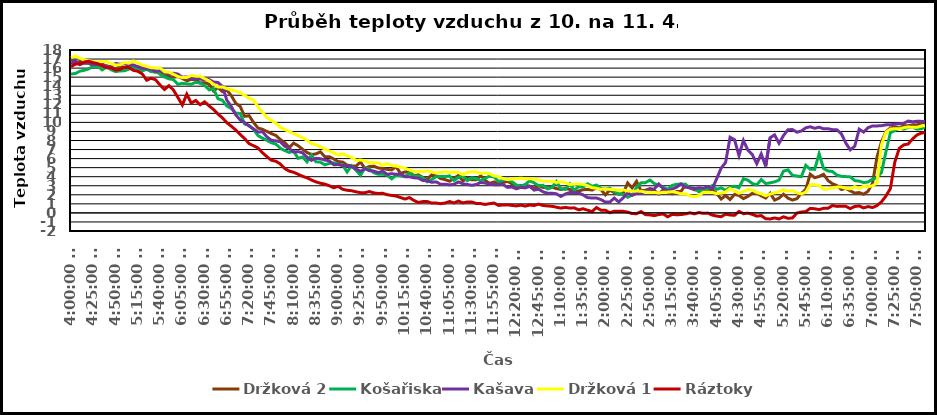
| Category | Držková 2 | Košařiska | Kašava | Držková 1 | Ráztoky |
|---|---|---|---|---|---|
| 0.6666666666666666 | 17.01 | 15.34 | 16.48 | 17.14 | 16.16 |
| 0.6701388888888888 | 16.48 | 15.41 | 16.83 | 17.33 | 16.45 |
| 0.673611111111111 | 16.75 | 15.66 | 16.38 | 17.1 | 16.44 |
| 0.677083333333333 | 16.54 | 15.76 | 16.6 | 16.93 | 16.67 |
| 0.680555555555555 | 16.53 | 15.92 | 16.56 | 16.82 | 16.76 |
| 0.684027777777778 | 16.26 | 16.21 | 16.41 | 16.7 | 16.6 |
| 0.6875 | 16.32 | 16.21 | 16.41 | 16.68 | 16.49 |
| 0.690972222222222 | 16.25 | 15.8 | 16.46 | 16.72 | 16.27 |
| 0.694444444444444 | 16.26 | 16.14 | 16.16 | 16.73 | 16.03 |
| 0.697916666666667 | 16.08 | 15.82 | 16.21 | 16.47 | 16.04 |
| 0.701388888888889 | 15.91 | 15.62 | 16.51 | 16.35 | 15.78 |
| 0.704861111111111 | 16.22 | 15.68 | 16.43 | 16.36 | 15.85 |
| 0.708333333333333 | 16 | 15.71 | 16.48 | 16.61 | 16.1 |
| 0.711805555555555 | 16.25 | 15.88 | 16.38 | 16.54 | 16.07 |
| 0.715277777777778 | 16.04 | 16.15 | 16.34 | 16.79 | 15.75 |
| 0.71875 | 16.15 | 15.92 | 16.16 | 16.58 | 15.65 |
| 0.722222222222222 | 15.98 | 15.7 | 15.98 | 16.33 | 15.36 |
| 0.725694444444444 | 15.95 | 15.87 | 15.96 | 16.19 | 14.66 |
| 0.729166666666666 | 15.64 | 15.61 | 15.85 | 16.04 | 14.88 |
| 0.732638888888889 | 15.55 | 15.7 | 15.66 | 16.02 | 14.71 |
| 0.736111111111111 | 15.57 | 15.32 | 15.7 | 16.02 | 14.13 |
| 0.739583333333333 | 15.18 | 15.01 | 15.56 | 15.6 | 13.64 |
| 0.743055555555555 | 15.08 | 14.81 | 15.31 | 15.54 | 14.06 |
| 0.746527777777777 | 14.99 | 14.73 | 15.44 | 15.33 | 13.58 |
| 0.75 | 15.06 | 14.21 | 15.34 | 15.07 | 12.76 |
| 0.753472222222222 | 14.86 | 14.32 | 15 | 14.95 | 11.92 |
| 0.756944444444444 | 14.6 | 14.26 | 15.01 | 14.95 | 13.12 |
| 0.760416666666666 | 14.75 | 14.21 | 14.85 | 15.19 | 12.14 |
| 0.763888888888889 | 14.73 | 14.44 | 14.83 | 15.11 | 12.42 |
| 0.767361111111111 | 14.36 | 14.34 | 14.79 | 15.1 | 11.95 |
| 0.770833333333333 | 14.39 | 14.08 | 14.7 | 14.83 | 12.27 |
| 0.774305555555556 | 14.24 | 13.59 | 14.74 | 14.6 | 11.83 |
| 0.777777777777778 | 13.47 | 13.73 | 14.46 | 14.22 | 11.43 |
| 0.78125 | 13.85 | 12.62 | 14.41 | 13.91 | 10.92 |
| 0.784722222222222 | 13.4 | 12.44 | 13.98 | 13.92 | 10.51 |
| 0.788194444444444 | 13.56 | 11.81 | 12.46 | 13.73 | 9.96 |
| 0.791666666666667 | 12.96 | 11.53 | 11.75 | 13.58 | 9.58 |
| 0.795138888888889 | 12.11 | 11.03 | 10.83 | 13.47 | 9.16 |
| 0.798611111111111 | 11.76 | 10.98 | 10.27 | 13.31 | 8.66 |
| 0.802083333333333 | 10.67 | 9.82 | 9.96 | 12.97 | 8.21 |
| 0.805555555555555 | 10.74 | 9.67 | 9.6 | 12.65 | 7.65 |
| 0.809027777777778 | 9.99 | 9.23 | 9.27 | 12.48 | 7.42 |
| 0.8125 | 9.37 | 8.54 | 8.93 | 11.69 | 7.17 |
| 0.815972222222222 | 9.24 | 8.25 | 8.97 | 11.11 | 6.65 |
| 0.819444444444444 | 9 | 8.02 | 8.4 | 10.54 | 6.21 |
| 0.822916666666666 | 8.76 | 7.75 | 8.02 | 10.22 | 5.82 |
| 0.826388888888889 | 8.56 | 7.61 | 7.96 | 9.91 | 5.71 |
| 0.829861111111111 | 8.11 | 7.14 | 7.86 | 9.46 | 5.41 |
| 0.833333333333333 | 7.77 | 6.89 | 7.37 | 9.21 | 4.9 |
| 0.836805555555555 | 7.23 | 6.68 | 7.11 | 8.98 | 4.62 |
| 0.840277777777777 | 7.71 | 6.82 | 6.72 | 8.76 | 4.49 |
| 0.84375 | 7.42 | 6.03 | 6.77 | 8.54 | 4.27 |
| 0.847222222222222 | 7.03 | 6.18 | 6.64 | 8.31 | 4.04 |
| 0.850694444444444 | 6.68 | 5.64 | 6.14 | 8.03 | 3.88 |
| 0.854166666666666 | 6.45 | 6.38 | 5.81 | 7.66 | 3.63 |
| 0.857638888888889 | 6.52 | 5.65 | 6.03 | 7.55 | 3.43 |
| 0.861111111111111 | 6.75 | 5.61 | 5.99 | 7.29 | 3.28 |
| 0.864583333333333 | 6.21 | 5.31 | 5.84 | 7.07 | 3.18 |
| 0.868055555555555 | 6.21 | 5.47 | 5.76 | 6.84 | 3 |
| 0.871527777777777 | 5.96 | 5.53 | 5.32 | 6.64 | 2.78 |
| 0.875 | 5.67 | 5.39 | 5.34 | 6.38 | 2.93 |
| 0.878472222222222 | 5.62 | 5.3 | 5.23 | 6.53 | 2.61 |
| 0.881944444444444 | 5.28 | 4.52 | 5.19 | 6.31 | 2.5 |
| 0.885416666666666 | 5.2 | 5.21 | 5.12 | 6.13 | 2.45 |
| 0.888888888888888 | 5.16 | 4.72 | 4.85 | 5.8 | 2.33 |
| 0.892361111111111 | 5.63 | 4.15 | 4.6 | 5.85 | 2.24 |
| 0.895833333333333 | 4.92 | 4.96 | 4.88 | 5.75 | 2.23 |
| 0.899305555555555 | 5.12 | 4.85 | 4.67 | 5.55 | 2.36 |
| 0.902777777777777 | 5.17 | 4.44 | 4.62 | 5.55 | 2.21 |
| 0.906249999999999 | 4.96 | 4.26 | 4.45 | 5.53 | 2.14 |
| 0.909722222222222 | 4.91 | 4.28 | 4.61 | 5.27 | 2.17 |
| 0.913194444444444 | 4.81 | 4.18 | 4.26 | 5.44 | 2.01 |
| 0.916666666666666 | 4.75 | 3.76 | 4.33 | 5.23 | 1.93 |
| 0.920138888888888 | 5.11 | 4.15 | 4.26 | 5.17 | 1.86 |
| 0.923611111111111 | 4.36 | 4.08 | 4.3 | 5.06 | 1.7 |
| 0.927083333333333 | 4.52 | 4.02 | 4 | 4.93 | 1.53 |
| 0.930555555555555 | 4.56 | 4.42 | 4 | 4.75 | 1.69 |
| 0.934027777777777 | 4.12 | 4.07 | 3.88 | 4.57 | 1.38 |
| 0.937499999999999 | 4.2 | 4.08 | 3.84 | 4.59 | 1.15 |
| 0.940972222222222 | 3.93 | 3.88 | 3.58 | 4.56 | 1.25 |
| 0.944444444444444 | 3.7 | 3.44 | 3.55 | 4.64 | 1.26 |
| 0.947916666666666 | 4.21 | 3.68 | 3.38 | 4.54 | 1.08 |
| 0.951388888888888 | 4.13 | 4.02 | 3.43 | 4.39 | 1.09 |
| 0.95486111111111 | 3.79 | 4.01 | 3.17 | 4.5 | 1.02 |
| 0.958333333333333 | 3.68 | 4.01 | 3.17 | 4.54 | 1.09 |
| 0.961805555555555 | 3.5 | 4.09 | 3.1 | 4.48 | 1.26 |
| 0.965277777777777 | 3.82 | 3.58 | 3.16 | 4.49 | 1.1 |
| 0.968749999999999 | 4.14 | 3.92 | 3.42 | 4.48 | 1.31 |
| 0.972222222222221 | 3.53 | 4.07 | 3.22 | 4.22 | 1.1 |
| 0.975694444444444 | 3.84 | 3.56 | 3.14 | 4.48 | 1.21 |
| 0.979166666666666 | 3.65 | 3.88 | 3.05 | 4.54 | 1.2 |
| 0.982638888888888 | 3.65 | 3.79 | 3.14 | 4.52 | 1.05 |
| 0.98611111111111 | 4.11 | 3.55 | 3.36 | 4.37 | 1.03 |
| 0.989583333333333 | 3.59 | 3.85 | 3.3 | 4.41 | 0.93 |
| 0.993055555555555 | 3.27 | 4.05 | 3.16 | 4.32 | 1.02 |
| 0.996527777777777 | 3.42 | 3.98 | 3.12 | 4.09 | 1.09 |
| 0.999999999999999 | 3.23 | 3.46 | 3.11 | 4.01 | 0.83 |
| 1900-01-01 00:05:00 | 3.33 | 3.62 | 3.15 | 3.79 | 0.87 |
| 1900-01-01 00:10:00 | 3.5 | 3.72 | 2.82 | 3.69 | 0.89 |
| 1900-01-01 00:15:00 | 3.22 | 3.46 | 2.86 | 3.74 | 0.83 |
| 1900-01-01 00:20:00 | 2.9 | 3.08 | 2.66 | 3.78 | 0.77 |
| 1900-01-01 00:25:00 | 3.03 | 2.96 | 2.82 | 3.84 | 0.86 |
| 1900-01-01 00:30:00 | 3.05 | 3.12 | 2.76 | 3.79 | 0.75 |
| 1900-01-01 00:35:00 | 2.96 | 3.57 | 2.93 | 3.77 | 0.87 |
| 1900-01-01 00:40:00 | 2.73 | 3.32 | 2.52 | 3.75 | 0.82 |
| 1900-01-01 00:45:00 | 2.99 | 3.01 | 2.63 | 3.63 | 0.97 |
| 1900-01-01 00:50:00 | 2.82 | 3.05 | 2.33 | 3.5 | 0.82 |
| 1900-01-01 00:55:00 | 2.76 | 2.65 | 2.18 | 3.5 | 0.77 |
| 1900-01-01 01:00:00 | 2.85 | 2.81 | 2.18 | 3.51 | 0.73 |
| 1900-01-01 01:05:00 | 2.69 | 3.47 | 2.11 | 3.36 | 0.63 |
| 1900-01-01 01:10:00 | 2.59 | 2.66 | 1.82 | 3.45 | 0.53 |
| 1900-01-01 01:15:00 | 2.7 | 2.6 | 2.08 | 3.36 | 0.61 |
| 1900-01-01 01:20:00 | 2.6 | 3.2 | 2.25 | 3.14 | 0.53 |
| 1900-01-01 01:25:00 | 2.31 | 2.5 | 2.24 | 3.17 | 0.56 |
| 1900-01-01 01:30:00 | 2.42 | 2.91 | 2.2 | 3.19 | 0.34 |
| 1900-01-01 01:35:00 | 2.56 | 2.83 | 1.99 | 3.14 | 0.46 |
| 1900-01-01 01:40:00 | 2.6 | 3.22 | 1.69 | 3.01 | 0.3 |
| 1900-01-01 01:45:00 | 2.52 | 2.94 | 1.64 | 2.79 | 0.14 |
| 1900-01-01 01:50:00 | 2.77 | 3.08 | 1.65 | 2.72 | 0.59 |
| 1900-01-01 01:55:00 | 2.58 | 2.69 | 1.47 | 2.6 | 0.3 |
| 1900-01-01 02:00:00 | 1.99 | 2.65 | 1.2 | 2.66 | 0.3 |
| 1900-01-01 02:05:00 | 2.52 | 2.74 | 1.2 | 2.6 | 0.02 |
| 1900-01-01 02:10:00 | 2.23 | 2.38 | 1.64 | 2.57 | 0.19 |
| 1900-01-01 02:15:00 | 2.07 | 2.05 | 1.2 | 2.49 | 0.19 |
| 1900-01-01 02:20:00 | 2.15 | 2.06 | 1.67 | 2.54 | 0.17 |
| 1900-01-01 02:25:00 | 3.31 | 1.73 | 2.23 | 2.43 | 0.09 |
| 1900-01-01 02:30:00 | 2.76 | 1.97 | 1.93 | 2.39 | -0.07 |
| 1900-01-01 02:35:00 | 3.49 | 2.81 | 2.16 | 2.41 | -0.09 |
| 1900-01-01 02:40:00 | 2.46 | 3.32 | 2.17 | 2.4 | 0.15 |
| 1900-01-01 02:45:00 | 2.5 | 3.34 | 2.4 | 2.29 | -0.19 |
| 1900-01-01 02:50:00 | 2.69 | 3.63 | 2.62 | 2.26 | -0.22 |
| 1900-01-01 02:55:00 | 2.45 | 3.24 | 2.66 | 2.26 | -0.3 |
| 1900-01-01 03:00:00 | 2.09 | 3.05 | 3.2 | 2.2 | -0.18 |
| 1900-01-01 03:05:00 | 2.56 | 2.84 | 2.7 | 2.28 | -0.12 |
| 1900-01-01 03:10:00 | 2.29 | 2.61 | 2.41 | 2.29 | -0.43 |
| 1900-01-01 03:15:00 | 2.1 | 3.04 | 2.64 | 2.34 | -0.16 |
| 1900-01-01 03:20:00 | 2.37 | 3.17 | 2.84 | 2.25 | -0.21 |
| 1900-01-01 03:25:00 | 2.38 | 3.19 | 3.2 | 2.11 | -0.18 |
| 1900-01-01 03:30:00 | 3.12 | 3.16 | 2.84 | 2.11 | -0.11 |
| 1900-01-01 03:35:00 | 2.76 | 2.74 | 2.77 | 1.88 | 0.01 |
| 1900-01-01 03:40:00 | 2.55 | 2.74 | 2.69 | 1.81 | -0.11 |
| 1900-01-01 03:45:00 | 2.47 | 2.34 | 2.78 | 1.9 | 0.04 |
| 1900-01-01 03:50:00 | 2.35 | 2.59 | 2.72 | 2.29 | -0.05 |
| 1900-01-01 03:55:00 | 2.42 | 2.66 | 2.91 | 2.28 | -0.02 |
| 1900-01-01 04:00:00 | 2.6 | 3.02 | 2.65 | 2.26 | -0.24 |
| 1900-01-01 04:05:00 | 2.15 | 2.61 | 3.78 | 2.14 | -0.35 |
| 1900-01-01 04:10:00 | 1.53 | 2.77 | 4.95 | 2.17 | -0.42 |
| 1900-01-01 04:15:00 | 1.91 | 2.5 | 5.58 | 2.32 | -0.14 |
| 1900-01-01 04:20:00 | 1.48 | 2.83 | 8.36 | 2.69 | -0.23 |
| 1900-01-01 04:25:00 | 2.04 | 2.94 | 8.09 | 2.43 | -0.27 |
| 1900-01-01 04:30:00 | 1.93 | 2.77 | 6.34 | 2.17 | 0.16 |
| 1900-01-01 04:35:00 | 1.58 | 3.77 | 8.01 | 2.38 | -0.09 |
| 1900-01-01 04:40:00 | 1.83 | 3.62 | 6.93 | 2.59 | -0.03 |
| 1900-01-01 04:45:00 | 2.16 | 3.25 | 6.44 | 2.51 | -0.16 |
| 1900-01-01 04:50:00 | 2.19 | 3.1 | 5.43 | 2.25 | -0.36 |
| 1900-01-01 04:55:00 | 1.88 | 3.68 | 6.52 | 2.11 | -0.3 |
| 1900-01-01 05:00:00 | 1.64 | 3.24 | 5.14 | 1.89 | -0.64 |
| 1900-01-01 05:05:00 | 2.17 | 3.32 | 8.31 | 2.08 | -0.67 |
| 1900-01-01 05:10:00 | 1.41 | 3.43 | 8.62 | 2.21 | -0.56 |
| 1900-01-01 05:15:00 | 1.63 | 3.62 | 7.69 | 2.35 | -0.67 |
| 1900-01-01 05:20:00 | 2.07 | 4.62 | 8.55 | 2.53 | -0.43 |
| 1900-01-01 05:25:00 | 1.63 | 4.75 | 9.19 | 2.39 | -0.6 |
| 1900-01-01 05:30:00 | 1.42 | 4.16 | 9.21 | 2.45 | -0.56 |
| 1900-01-01 05:35:00 | 1.57 | 4.07 | 8.92 | 2.22 | -0.02 |
| 1900-01-01 05:40:00 | 2.15 | 4 | 9.05 | 2.1 | 0.1 |
| 1900-01-01 05:45:00 | 2.6 | 5.26 | 9.4 | 2.29 | 0.14 |
| 1900-01-01 05:50:00 | 4.28 | 4.83 | 9.52 | 3.12 | 0.5 |
| 1900-01-01 05:55:00 | 3.89 | 4.81 | 9.35 | 3.13 | 0.46 |
| 1900-01-01 06:00:00 | 4.02 | 6.53 | 9.47 | 3.03 | 0.36 |
| 1900-01-01 06:05:00 | 4.27 | 4.9 | 9.29 | 2.61 | 0.51 |
| 1900-01-01 06:10:00 | 3.57 | 4.63 | 9.3 | 2.66 | 0.51 |
| 1900-01-01 06:15:00 | 3.22 | 4.57 | 9.2 | 2.75 | 0.82 |
| 1900-01-01 06:20:00 | 3.02 | 4.17 | 9.18 | 2.85 | 0.72 |
| 1900-01-01 06:25:00 | 2.59 | 4.04 | 8.74 | 2.85 | 0.73 |
| 1900-01-01 06:30:00 | 2.71 | 4.01 | 7.71 | 2.72 | 0.73 |
| 1900-01-01 06:35:00 | 2.43 | 3.98 | 6.97 | 2.66 | 0.48 |
| 1900-01-01 06:40:00 | 2.19 | 3.57 | 7.37 | 2.91 | 0.71 |
| 1900-01-01 06:45:00 | 2.25 | 3.51 | 9.25 | 2.71 | 0.77 |
| 1900-01-01 06:50:00 | 2.06 | 3.35 | 8.92 | 2.95 | 0.55 |
| 1900-01-01 06:55:00 | 2.4 | 3.42 | 9.42 | 2.89 | 0.7 |
| 1900-01-01 07:00:00 | 3.3 | 3.74 | 9.61 | 3.01 | 0.59 |
| 1900-01-01 07:05:00 | 6.18 | 3.9 | 9.61 | 3.3 | 0.81 |
| 1900-01-01 07:10:00 | 7.86 | 4.47 | 9.64 | 7.52 | 1.22 |
| 1900-01-01 07:15:00 | 8.95 | 6.73 | 9.73 | 8.9 | 1.86 |
| 1900-01-01 07:20:00 | 9.39 | 8.86 | 9.73 | 9.26 | 2.69 |
| 1900-01-01 07:25:00 | 9.5 | 9.09 | 9.8 | 9.31 | 5.62 |
| 1900-01-01 07:30:00 | 9.39 | 9.4 | 9.85 | 9.28 | 7.14 |
| 1900-01-01 07:35:00 | 9.62 | 9.25 | 9.89 | 9.41 | 7.52 |
| 1900-01-01 07:40:00 | 9.64 | 9.46 | 10.15 | 9.5 | 7.61 |
| 1900-01-01 07:45:00 | 9.74 | 9.47 | 10.07 | 9.45 | 8.18 |
| 1900-01-01 07:50:00 | 9.72 | 9.26 | 10.13 | 9.46 | 8.62 |
| 1900-01-01 07:55:00 | 9.94 | 9.31 | 10.11 | 9.6 | 8.83 |
| 1900-01-01 08:00:00 | 10.01 | 9.54 | 10.1 | 9.65 | 8.88 |